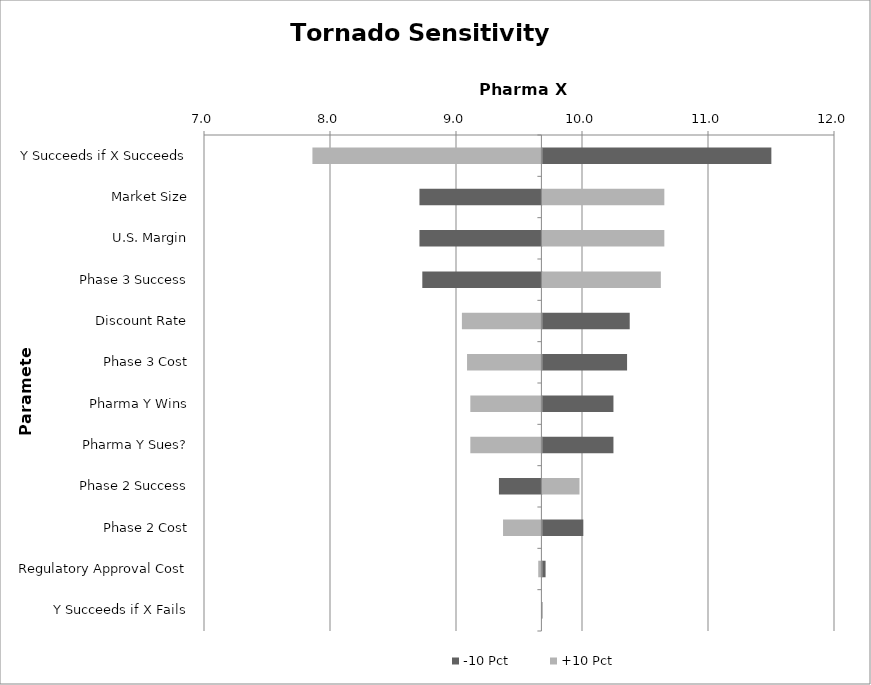
| Category | -10 Pct | +10 Pct |
|---|---|---|
| Y Succeeds if X Succeeds | 11.495 | 7.861 |
| Market Size | 8.71 | 10.646 |
| U.S. Margin | 8.71 | 10.646 |
| Phase 3 Success | 8.733 | 10.618 |
| Discount Rate | 10.371 | 9.047 |
| Phase 3 Cost | 10.35 | 9.088 |
| Pharma Y Wins | 10.242 | 9.114 |
| Pharma Y Sues? | 10.242 | 9.114 |
| Phase 2 Success | 9.341 | 9.972 |
| Phase 2 Cost | 10.002 | 9.373 |
| Regulatory Approval Cost | 9.703 | 9.653 |
| Y Succeeds if X Fails | 9.678 | 9.678 |